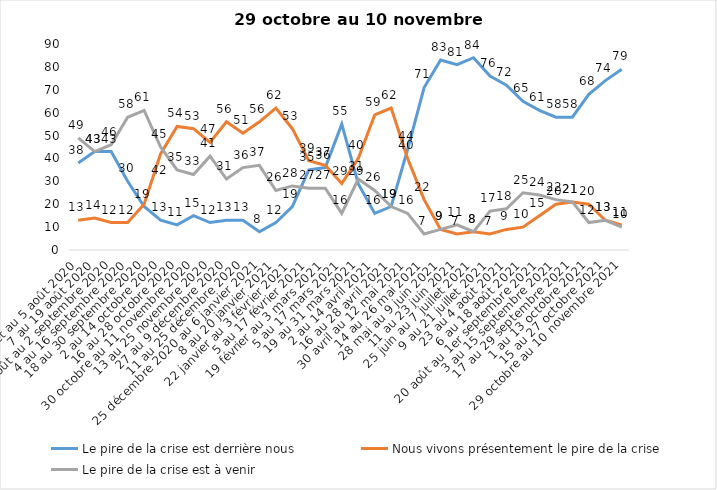
| Category | Le pire de la crise est derrière nous | Nous vivons présentement le pire de la crise | Le pire de la crise est à venir |
|---|---|---|---|
| 24 juillet au 5 août 2020 | 38 | 13 | 49 |
| 7 au 19 août 2020 | 43 | 14 | 43 |
| 21 août au 2 septembre 2020 | 43 | 12 | 46 |
| 4 au 16 septembre 2020 | 30 | 12 | 58 |
| 18 au 30 septembre 2020 | 19 | 20 | 61 |
| 2 au 14 octobre 2020 | 13 | 42 | 45 |
| 16 au 28 octobre 2020 | 11 | 54 | 35 |
| 30 octobre au 11 novembre 2020 | 15 | 53 | 33 |
| 13 au 25 novembre 2020 | 12 | 47 | 41 |
| 27 au 9 décembre 2020 | 13 | 56 | 31 |
| 11 au 25 décembre 2020 | 13 | 51 | 36 |
| 25 décembre 2020 au 6 janvier 2021 | 8 | 56 | 37 |
| 8 au 20 janvier 2021 | 12 | 62 | 26 |
| 22 janvier au 3 février 2021 | 19 | 53 | 28 |
| 5 au 17 février 2021 | 35 | 39 | 27 |
| 19 février au 3 mars 2021 | 36 | 37 | 27 |
| 5 au 17 mars 2021 | 55 | 29 | 16 |
| 19 au 31 mars 2021 | 29 | 40 | 31 |
| 2 au 14 avril 2021 | 16 | 59 | 26 |
| 16 au 28 avril 2021 | 19 | 62 | 19 |
| 30 avril au 12 mai 2021 | 44 | 40 | 16 |
| 14 au 26 mai 2021 | 71 | 22 | 7 |
| 28 mai au 9 juin 2021 | 83 | 9 | 9 |
| 11 au 23 juin 2021 | 81 | 7 | 11 |
| 25 juin au 7 juillet 2021 | 84 | 8 | 8 |
| 9 au 21 juillet 2021 | 76 | 7 | 17 |
| 23 au 4 août 2021 | 72 | 9 | 18 |
| 6 au 18 août 2021 | 65 | 10 | 25 |
| 20 août au 1er septembre 2021 | 61 | 15 | 24 |
| 3 au 15 septembre 2021 | 58 | 20 | 22 |
| 17 au 29 septembre 2021 | 58 | 21 | 21 |
| 1 au 13 octobre 2021 | 68 | 20 | 12 |
| 15 au 27 octobre 2021 | 74 | 13 | 13 |
| 29 octobre au 10 novembre 2021 | 79 | 11 | 10 |